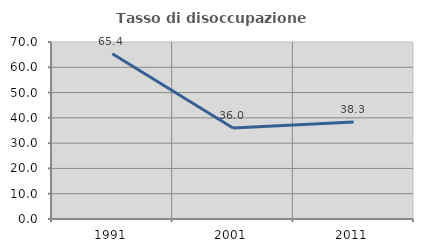
| Category | Tasso di disoccupazione giovanile  |
|---|---|
| 1991.0 | 65.354 |
| 2001.0 | 35.955 |
| 2011.0 | 38.333 |